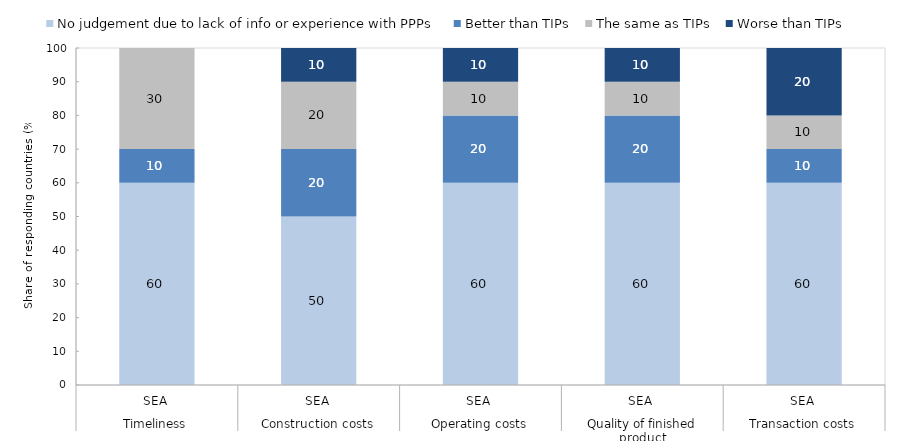
| Category | No judgement due to lack of info or experience with PPPs | Better than TIPs | The same as TIPs | Worse than TIPs |
|---|---|---|---|---|
| 0 | 60 | 10 | 30 | 0 |
| 1 | 50 | 20 | 20 | 10 |
| 2 | 60 | 20 | 10 | 10 |
| 3 | 60 | 20 | 10 | 10 |
| 4 | 60 | 10 | 10 | 20 |